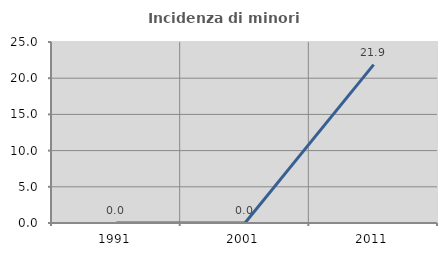
| Category | Incidenza di minori stranieri |
|---|---|
| 1991.0 | 0 |
| 2001.0 | 0 |
| 2011.0 | 21.875 |